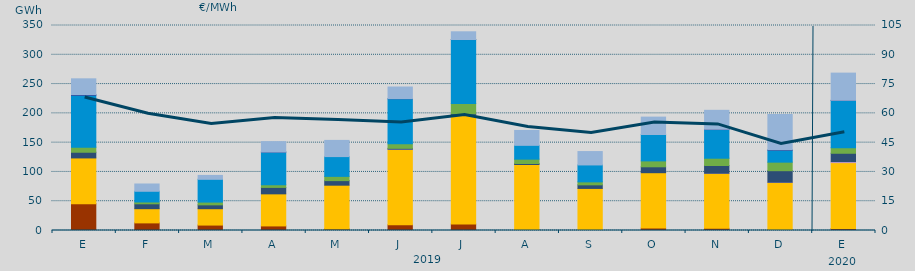
| Category | Carbón | Ciclo Combinado | Cogeneración | Consumo Bombeo | Eólica | Hidráulica | Nuclear | Otras Renovables | Solar fotovoltaica | Turbinación bombeo |
|---|---|---|---|---|---|---|---|---|---|---|
| E | 45764.1 | 78136.9 | 0 | 9703.8 | 8718.7 | 88684.7 | 1159.3 | 0 | 0 | 26791.4 |
| F | 13008.4 | 24231.2 | 0 | 8329.6 | 3127.4 | 18281.1 | 0 | 0 | 0 | 12422.8 |
| M | 9261.4 | 27952 | 0 | 6580.9 | 4696.4 | 38895.4 | 0 | 0 | 0 | 6656.1 |
| A | 7813.1 | 54755.9 | 0 | 11010.9 | 4506.1 | 55784.8 | 149.4 | 0 | 0 | 17672.7 |
| M | 2747.5 | 74607.7 | 0 | 7818.6 | 7248.2 | 33753.6 | 0 | 0 | 0 | 27655 |
| J | 9630 | 128693.8 | 467.1 | 1487.8 | 7835.7 | 76799.4 | 366 | 20 | 0 | 19680.5 |
| J | 11017.4 | 186524.2 | 300.4 | 1392.5 | 17639.5 | 109155.5 | 60 | 0 | 0 | 13153.1 |
| A | 1459.4 | 111215 | 0 | 1733.4 | 7402.2 | 23588.2 | 0 | 0 | 0 | 25429.5 |
| S | 311.6 | 71523.4 | 0 | 6112.7 | 5081.7 | 28895.9 | 0 | 0 | 0 | 22840.2 |
| O | 4163.7 | 94511.7 | 0 | 10093.2 | 10069.8 | 45049.8 | 0 | 0 | 0 | 29699 |
| N | 3677.8 | 93991.4 | 51.5 | 13298.4 | 12383 | 48971.8 | 539 | 0 | 0 | 32260 |
| D | 1607.3 | 80390.7 | 371.4 | 19733.1 | 14568.3 | 20541.3 | 876.4 | 0 | 1.2 | 60128.2 |
| E | 3376.2 | 112471.6 | 1718.3 | 14293.3 | 9539.1 | 80742.1 | 186 | 0 | 0 | 46371.3 |